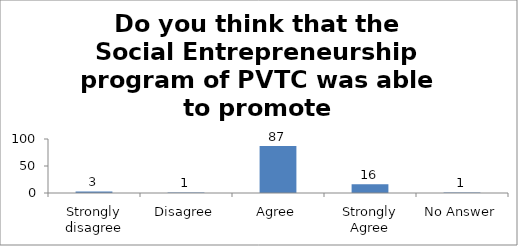
| Category | Do you think that the Social Entrepreneurship program of PVTC was able to promote entrepreneurial mind-set among youth? |
|---|---|
| Strongly disagree | 3 |
| Disagree | 1 |
| Agree | 87 |
| Strongly Agree | 16 |
| No Answer | 1 |